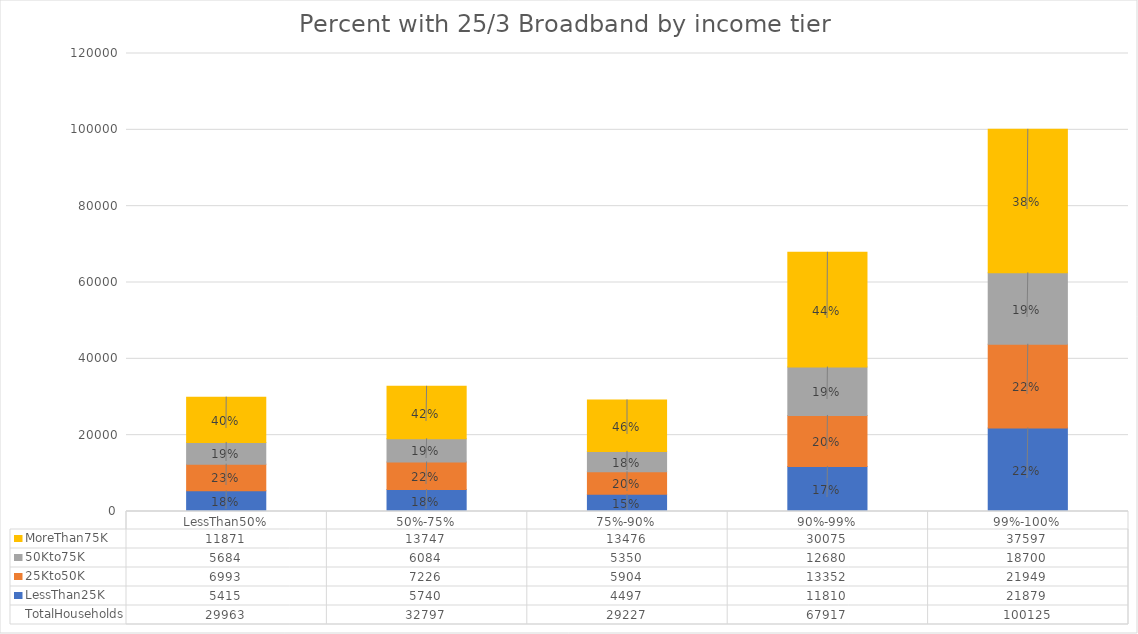
| Category | LessThan25K | 25Kto50K | 50Kto75K | MoreThan75K |
|---|---|---|---|---|
| LessThan50% | 5415 | 6993 | 5684 | 11871 |
| 50%-75% | 5740 | 7226 | 6084 | 13747 |
| 75%-90% | 4497 | 5904 | 5350 | 13476 |
| 90%-99% | 11810 | 13352 | 12680 | 30075 |
| 99%-100% | 21879 | 21949 | 18700 | 37597 |